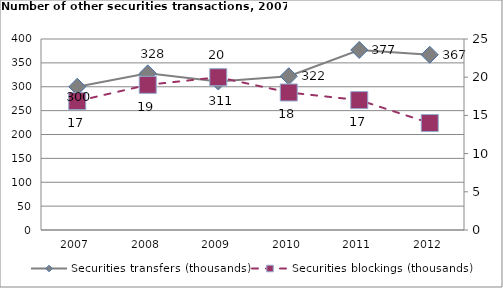
| Category | Securities transfers (thousands) |
|---|---|
| 2007.0 | 299.947 |
| 2008.0 | 328 |
| 2009.0 | 311 |
| 2010.0 | 322 |
| 2011.0 | 377 |
| 2012.0 | 367 |